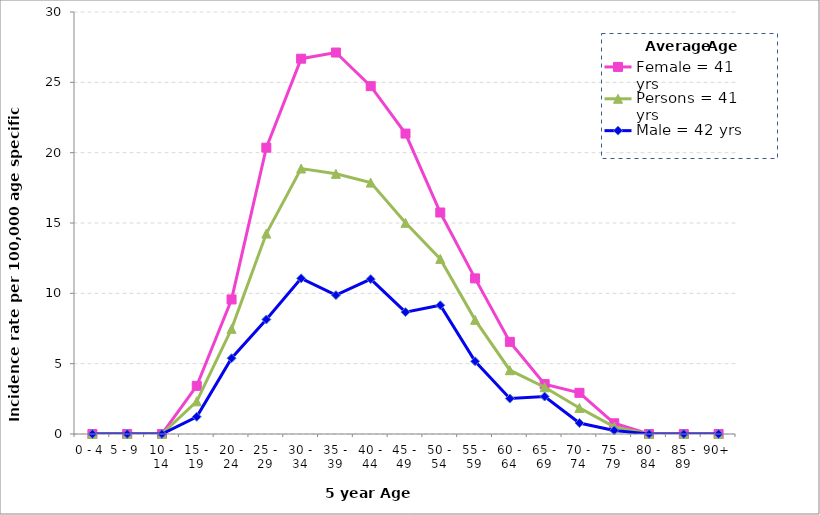
| Category | Female = 41 yrs | Persons = 41 yrs | Male = 42 yrs |
|---|---|---|---|
| 0 - 4 | 0 | 0 | 0 |
| 5 - 9 | 0 | 0 | 0 |
| 10 - 14 | 0 | 0 | 0 |
| 15 - 19 | 3.422 | 2.322 | 1.222 |
| 20 - 24 | 9.565 | 7.476 | 5.387 |
| 25 - 29 | 20.354 | 14.248 | 8.142 |
| 30 - 34 | 26.68 | 18.873 | 11.066 |
| 35 - 39 | 27.118 | 18.495 | 9.872 |
| 40 - 44 | 24.728 | 17.871 | 11.014 |
| 45 - 49 | 21.357 | 15.011 | 8.664 |
| 50 - 54 | 15.746 | 12.448 | 9.15 |
| 55 - 59 | 11.062 | 8.116 | 5.17 |
| 60 - 64 | 6.55 | 4.535 | 2.519 |
| 65 - 69 | 3.546 | 3.325 | 2.66 |
| 70 - 74 | 2.926 | 1.853 | 0.78 |
| 75 - 79 | 0.762 | 0.508 | 0.254 |
| 80 - 84 | 0 | 0 | 0 |
| 85 - 89 | 0 | 0 | 0 |
| 90+ | 0 | 0 | 0 |